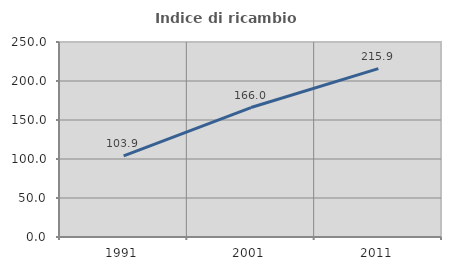
| Category | Indice di ricambio occupazionale  |
|---|---|
| 1991.0 | 103.947 |
| 2001.0 | 165.957 |
| 2011.0 | 215.909 |